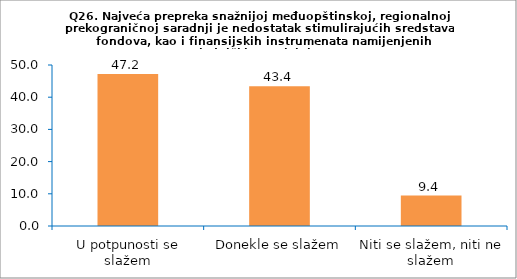
| Category | Series 0 |
|---|---|
| U potpunosti se slažem | 47.17 |
| Donekle se slažem | 43.396 |
| Niti se slažem, niti ne slažem | 9.434 |